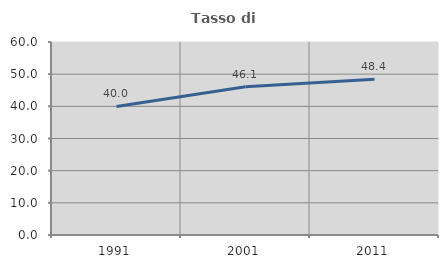
| Category | Tasso di occupazione   |
|---|---|
| 1991.0 | 39.965 |
| 2001.0 | 46.06 |
| 2011.0 | 48.419 |